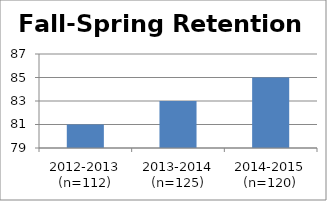
| Category | Retention Rate |
|---|---|
| 2012-2013 (n=112) | 81 |
| 2013-2014 (n=125) | 83 |
| 2014-2015 (n=120) | 85 |